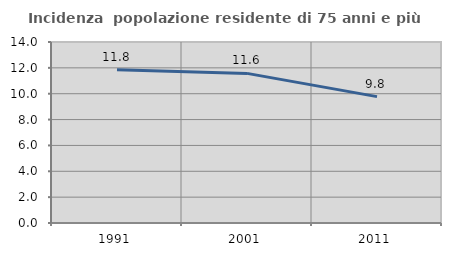
| Category | Incidenza  popolazione residente di 75 anni e più |
|---|---|
| 1991.0 | 11.849 |
| 2001.0 | 11.572 |
| 2011.0 | 9.773 |